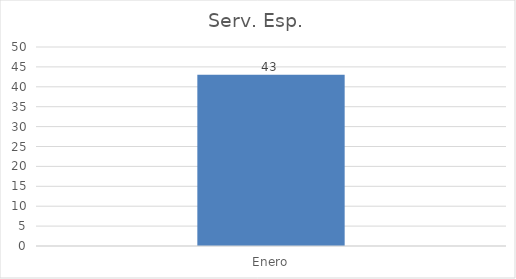
| Category | Serv. Esp. |
|---|---|
| Enero | 43 |